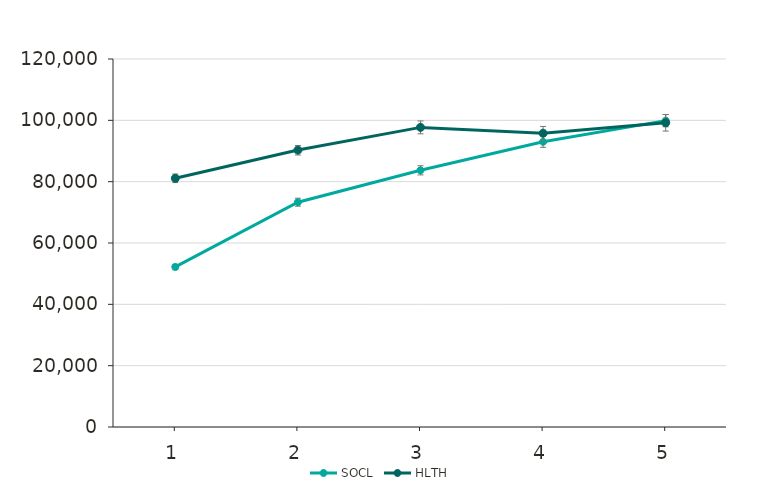
| Category | SOCL | HLTH |
|---|---|---|
| 1.0 | 52200 | 81100 |
| 2.0 | 73300 | 90300 |
| 3.0 | 83700 | 97700 |
| 4.0 | 93000 | 95800 |
| 5.0 | 99900 | 99200 |